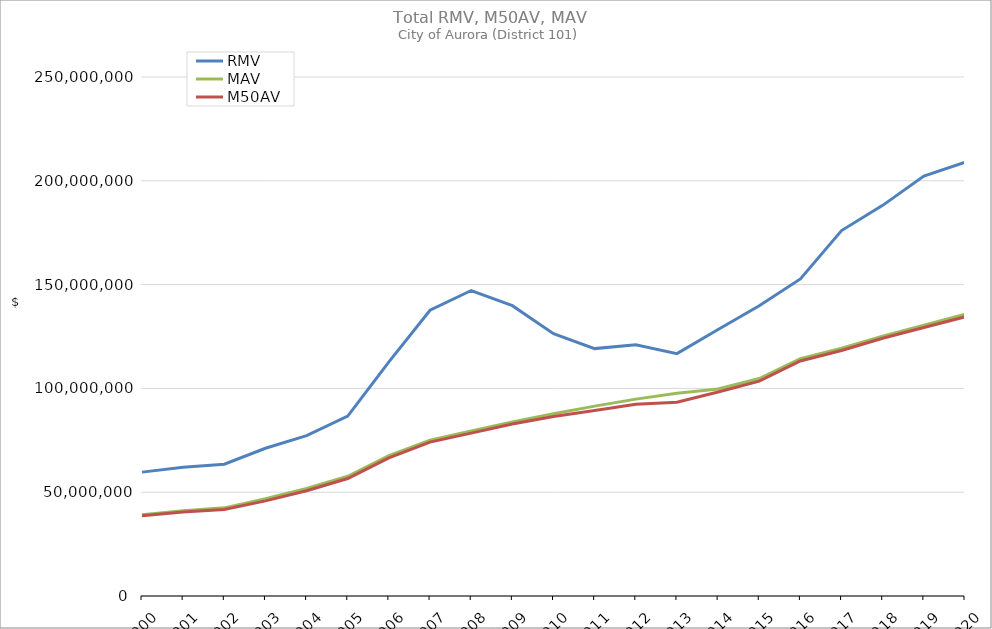
| Category | RMV | MAV | M50AV |
|---|---|---|---|
| 2000.0 | 59668547 | 39184029 | 38610584 |
| 2001.0 | 62020737 | 41109080 | 40417516 |
| 2002.0 | 63506375 | 42454050 | 41708983 |
| 2003.0 | 71175432 | 46859799 | 45817388 |
| 2004.0 | 77250362 | 51787477 | 50683308 |
| 2005.0 | 86687826 | 57684728 | 56596506 |
| 2006.0 | 112802951 | 67560960 | 66564456 |
| 2007.0 | 137652034 | 75091991 | 74117911 |
| 2008.0 | 147150751 | 79472126 | 78459985 |
| 2009.0 | 139864971 | 83786668 | 82822968 |
| 2010.0 | 126382036 | 87800752 | 86481071 |
| 2011.0 | 119168269 | 91459952 | 89386459 |
| 2012.0 | 121008057 | 94829175 | 92373853 |
| 2013.0 | 116735664 | 97669025 | 93341006 |
| 2014.0 | 128380047 | 99684366 | 98273945 |
| 2015.0 | 139777108 | 104754411 | 103518788 |
| 2016.0 | 152738494 | 114379180 | 113192804 |
| 2017.0 | 176044430 | 119400839 | 118228932 |
| 2018.0 | 188169925 | 125185612 | 124141505 |
| 2019.0 | 202259074 | 130478470 | 129349136 |
| 2020.0 | 208909868 | 135672623 | 134448596 |